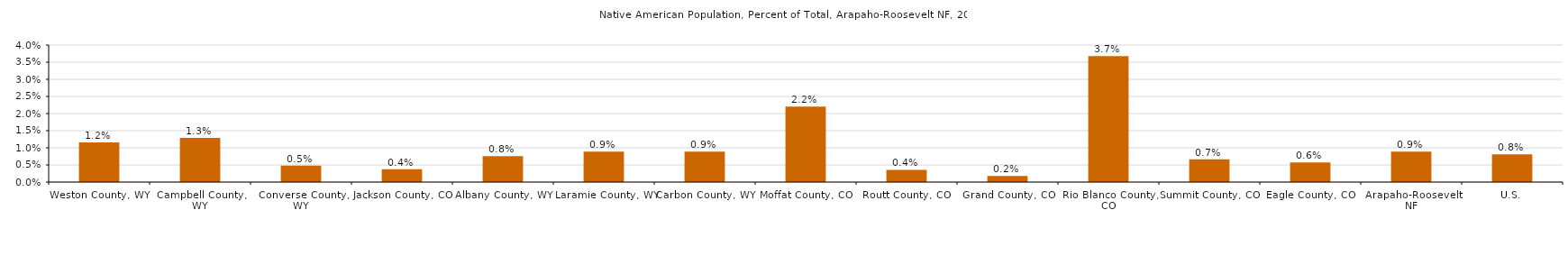
| Category | Total Native American |
|---|---|
| Gallatin County, MT | 0.01 |
| County Region | 0.01 |
| U.S. | 0.008 |